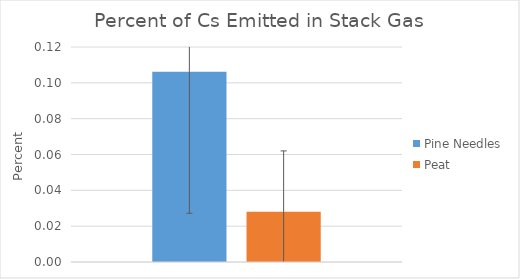
| Category | Pine Needles | Peat |
|---|---|---|
| 0 | 0.106 | 0.028 |